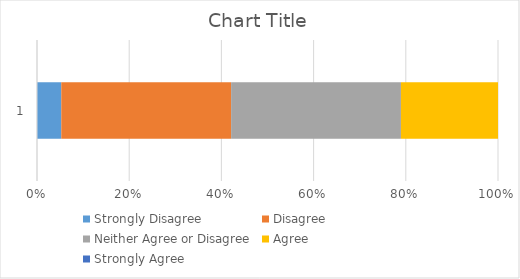
| Category | Strongly Disagree | Disagree | Neither Agree or Disagree | Agree | Strongly Agree |
|---|---|---|---|---|---|
| 0 | 1 | 7 | 7 | 4 | 0 |